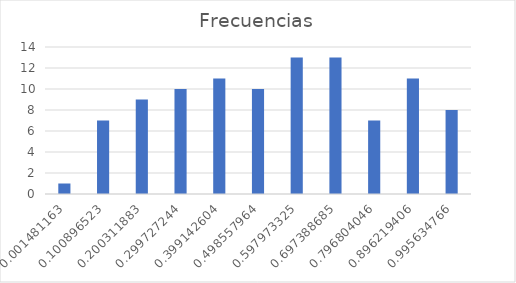
| Category | Frecuencias |
|---|---|
| 0.001481162512145695 | 1 |
| 0.10089652289505453 | 7 |
| 0.20031188327796337 | 9 |
| 0.2997272436608722 | 10 |
| 0.39914260404378105 | 11 |
| 0.49855796442668987 | 10 |
| 0.5979733248095987 | 13 |
| 0.6973886851925076 | 13 |
| 0.7968040455754165 | 7 |
| 0.8962194059583254 | 11 |
| 0.9956347663412343 | 8 |